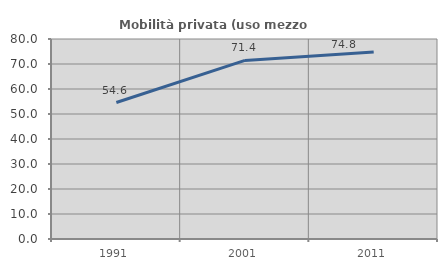
| Category | Mobilità privata (uso mezzo privato) |
|---|---|
| 1991.0 | 54.592 |
| 2001.0 | 71.443 |
| 2011.0 | 74.817 |